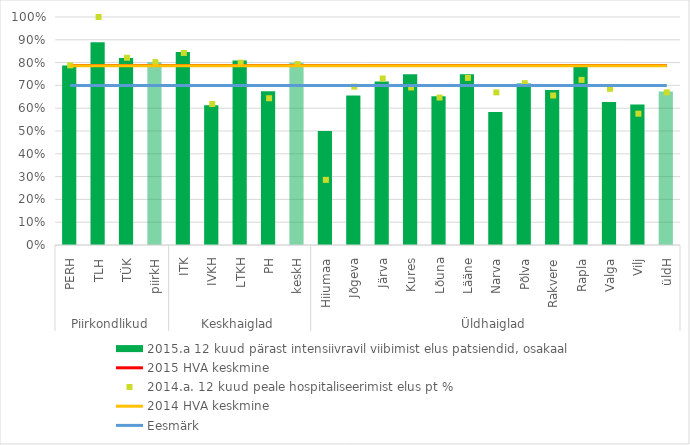
| Category | 2015.a 12 kuud pärast intensiivravil viibimist elus patsiendid, osakaal |
|---|---|
| 0 | 0.788 |
| 1 | 0.889 |
| 2 | 0.82 |
| 3 | 0.801 |
| 4 | 0.847 |
| 5 | 0.613 |
| 6 | 0.809 |
| 7 | 0.675 |
| 8 | 0.8 |
| 9 | 0.5 |
| 10 | 0.655 |
| 11 | 0.717 |
| 12 | 0.749 |
| 13 | 0.652 |
| 14 | 0.749 |
| 15 | 0.583 |
| 16 | 0.708 |
| 17 | 0.68 |
| 18 | 0.784 |
| 19 | 0.628 |
| 20 | 0.616 |
| 21 | 0.674 |